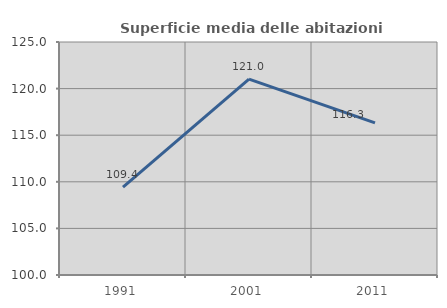
| Category | Superficie media delle abitazioni occupate |
|---|---|
| 1991.0 | 109.439 |
| 2001.0 | 121.025 |
| 2011.0 | 116.317 |